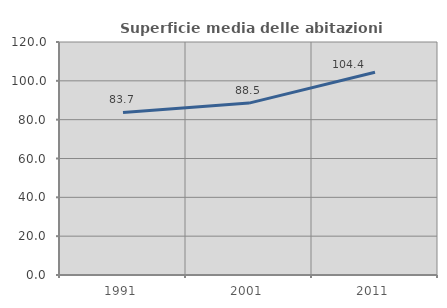
| Category | Superficie media delle abitazioni occupate |
|---|---|
| 1991.0 | 83.72 |
| 2001.0 | 88.537 |
| 2011.0 | 104.431 |